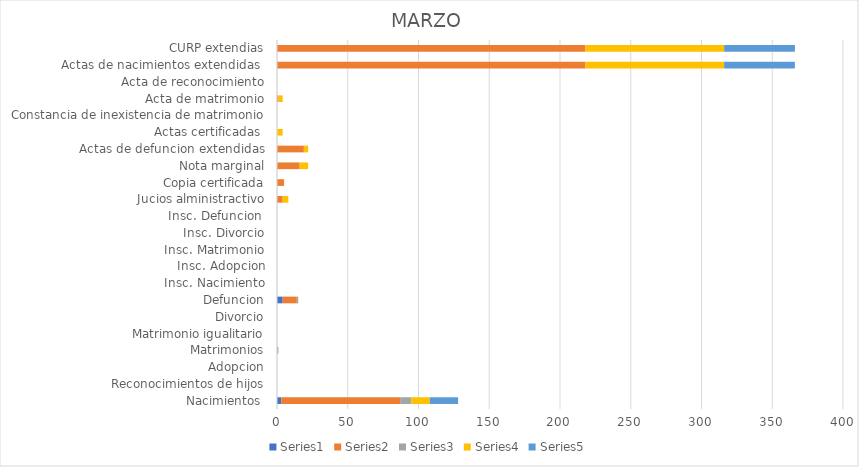
| Category | Series 0 | Series 1 | Series 2 | Series 3 | Series 4 |
|---|---|---|---|---|---|
| Nacimientos  | 3 | 84 | 8 | 13 | 20 |
| Reconocimientos de hijos | 0 | 0 | 0 | 0 | 0 |
| Adopcion | 0 | 0 | 0 | 0 | 0 |
| Matrimonios | 0 | 0 | 1 | 0 | 0 |
| Matrimonio igualitario | 0 | 0 | 0 | 0 | 0 |
| Divorcio | 0 | 0 | 0 | 0 | 0 |
| Defuncion | 4 | 10 | 1 | 0 | 0 |
| Insc. Nacimiento | 0 | 0 | 0 | 0 | 0 |
| Insc. Adopcion | 0 | 0 | 0 | 0 | 0 |
| Insc. Matrimonio | 0 | 0 | 0 | 0 | 0 |
| Insc. Divorcio | 0 | 0 | 0 | 0 | 0 |
| Insc. Defuncion  | 0 | 0 | 0 | 0 | 0 |
| Jucios alministractivo | 0 | 4 | 0 | 4 | 0 |
| Copia certificada | 0 | 5 | 0 | 0 | 0 |
| Nota marginal | 0 | 16 | 0 | 6 | 0 |
| Actas de defuncion extendidas | 0 | 19 | 0 | 3 | 0 |
| Actas certificadas  | 0 | 0 | 0 | 4 | 0 |
| Constancia de inexistencia de matrimonio | 0 | 0 | 0 | 0 | 0 |
| Acta de matrimonio | 0 | 1 | 0 | 3 | 0 |
| Acta de reconocimiento | 0 | 0 | 0 | 0 | 0 |
| Actas de nacimientos extendidas  | 0 | 218 | 0 | 98 | 50 |
| CURP extendias | 0 | 218 | 0 | 98 | 50 |